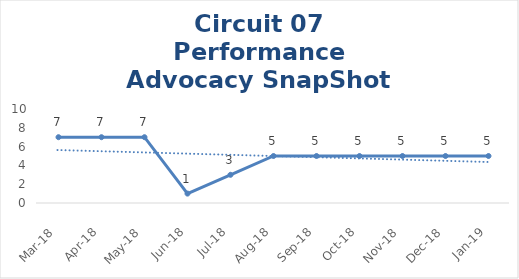
| Category | Circuit 07 |
|---|---|
| Mar-18 | 7 |
| Apr-18 | 7 |
| May-18 | 7 |
| Jun-18 | 1 |
| Jul-18 | 3 |
| Aug-18 | 5 |
| Sep-18 | 5 |
| Oct-18 | 5 |
| Nov-18 | 5 |
| Dec-18 | 5 |
| Jan-19 | 5 |